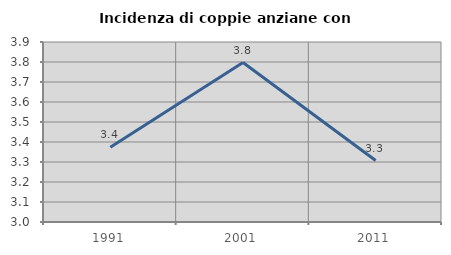
| Category | Incidenza di coppie anziane con figli |
|---|---|
| 1991.0 | 3.373 |
| 2001.0 | 3.797 |
| 2011.0 | 3.307 |